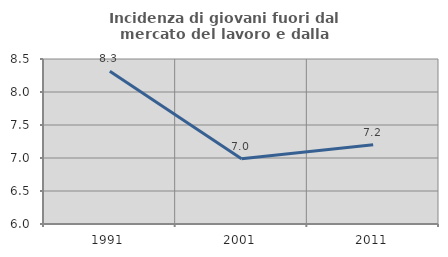
| Category | Incidenza di giovani fuori dal mercato del lavoro e dalla formazione  |
|---|---|
| 1991.0 | 8.316 |
| 2001.0 | 6.988 |
| 2011.0 | 7.2 |